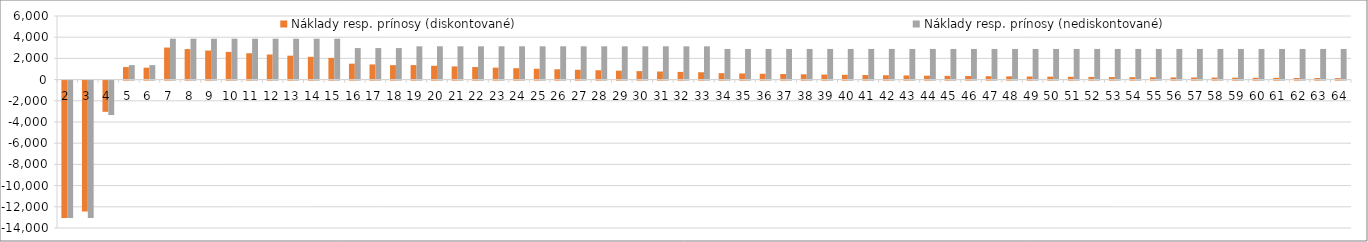
| Category | Náklady resp. prínosy (diskontované) | Náklady resp. prínosy (nediskontované) |
|---|---|---|
| 2.0 | -12955.776 | -12955.776 |
| 3.0 | -12338.834 | -12955.776 |
| 4.0 | -2947.61 | -3249.74 |
| 5.0 | 1181.688 | 1367.952 |
| 6.0 | 1125.418 | 1367.952 |
| 7.0 | 3023.507 | 3858.846 |
| 8.0 | 2879.531 | 3858.846 |
| 9.0 | 2742.41 | 3858.846 |
| 10.0 | 2611.819 | 3858.846 |
| 11.0 | 2487.447 | 3858.846 |
| 12.0 | 2368.997 | 3858.846 |
| 13.0 | 2256.188 | 3858.846 |
| 14.0 | 2148.75 | 3858.846 |
| 15.0 | 2046.429 | 3858.846 |
| 16.0 | 1503.187 | 2976.207 |
| 17.0 | 1431.606 | 2976.207 |
| 18.0 | 1363.435 | 2976.207 |
| 19.0 | 1370.363 | 3140.898 |
| 20.0 | 1305.108 | 3140.898 |
| 21.0 | 1242.96 | 3140.898 |
| 22.0 | 1183.771 | 3140.898 |
| 23.0 | 1127.401 | 3140.898 |
| 24.0 | 1073.715 | 3140.898 |
| 25.0 | 1022.586 | 3140.898 |
| 26.0 | 973.892 | 3140.898 |
| 27.0 | 927.516 | 3140.898 |
| 28.0 | 883.348 | 3140.898 |
| 29.0 | 841.284 | 3140.898 |
| 30.0 | 801.223 | 3140.898 |
| 31.0 | 763.07 | 3140.898 |
| 32.0 | 726.733 | 3140.898 |
| 33.0 | 692.127 | 3140.898 |
| 34.0 | 606.813 | 2891.427 |
| 35.0 | 577.917 | 2891.427 |
| 36.0 | 550.397 | 2891.427 |
| 37.0 | 524.188 | 2891.427 |
| 38.0 | 499.226 | 2891.427 |
| 39.0 | 475.454 | 2891.427 |
| 40.0 | 452.813 | 2891.427 |
| 41.0 | 431.251 | 2891.427 |
| 42.0 | 410.715 | 2891.427 |
| 43.0 | 391.157 | 2891.427 |
| 44.0 | 372.53 | 2891.427 |
| 45.0 | 354.791 | 2891.427 |
| 46.0 | 337.896 | 2891.427 |
| 47.0 | 321.806 | 2891.427 |
| 48.0 | 306.482 | 2891.427 |
| 49.0 | 291.887 | 2891.427 |
| 50.0 | 277.988 | 2891.427 |
| 51.0 | 264.75 | 2891.427 |
| 52.0 | 252.143 | 2891.427 |
| 53.0 | 240.136 | 2891.427 |
| 54.0 | 228.701 | 2891.427 |
| 55.0 | 217.811 | 2891.427 |
| 56.0 | 207.439 | 2891.427 |
| 57.0 | 197.561 | 2891.427 |
| 58.0 | 188.153 | 2891.427 |
| 59.0 | 179.193 | 2891.427 |
| 60.0 | 170.66 | 2891.427 |
| 61.0 | 162.534 | 2891.427 |
| 62.0 | 154.794 | 2891.427 |
| 63.0 | 147.423 | 2891.427 |
| 64.0 | 140.403 | 2891.427 |